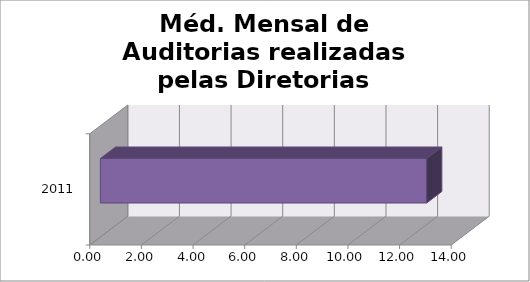
| Category | Méd. Mensal |
|---|---|
| 2011.0 | 12.636 |